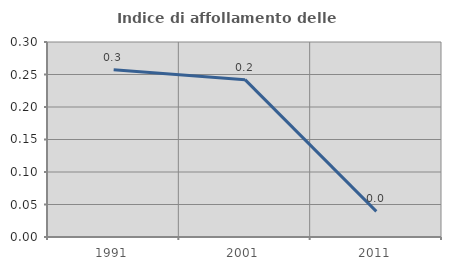
| Category | Indice di affollamento delle abitazioni  |
|---|---|
| 1991.0 | 0.257 |
| 2001.0 | 0.242 |
| 2011.0 | 0.039 |